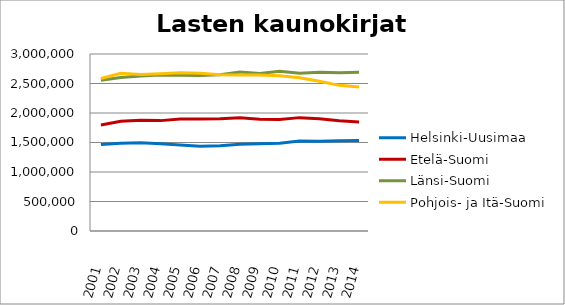
| Category | Helsinki-Uusimaa | Etelä-Suomi | Länsi-Suomi | Pohjois- ja Itä-Suomi |
|---|---|---|---|---|
| 2001.0 | 1464430 | 1798302 | 2554174 | 2586046 |
| 2002.0 | 1489165 | 1860386 | 2601966 | 2671862 |
| 2003.0 | 1497659 | 1878217 | 2626383 | 2652588 |
| 2004.0 | 1479399 | 1870815 | 2645402 | 2665231 |
| 2005.0 | 1457532 | 1897159 | 2641526 | 2680660 |
| 2006.0 | 1437648 | 1897591 | 2635759 | 2673487 |
| 2007.0 | 1444194 | 1902246 | 2648562 | 2649333 |
| 2008.0 | 1469104 | 1919337 | 2693553 | 2645087 |
| 2009.0 | 1478556 | 1893117 | 2671018 | 2642431 |
| 2010.0 | 1486418 | 1890215 | 2708958 | 2629307 |
| 2011.0 | 1524440 | 1921538 | 2673494 | 2596862 |
| 2012.0 | 1519172 | 1903416 | 2692608 | 2537122 |
| 2013.0 | 1530711 | 1867875 | 2683811 | 2468298 |
| 2014.0 | 1532633 | 1847144 | 2692039 | 2442092 |